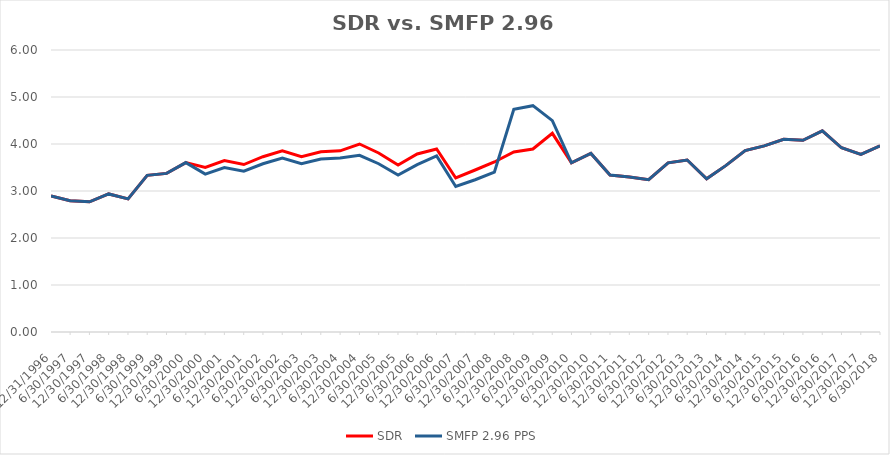
| Category | SDR | SMFP 2.96 PPS |
|---|---|---|
| 12/31/96 | 2.896 | 2.896 |
| 6/30/97 | 2.792 | 2.792 |
| 12/31/97 | 2.771 | 2.771 |
| 6/30/98 | 2.938 | 2.938 |
| 12/31/98 | 2.833 | 2.833 |
| 6/30/99 | 3.333 | 3.333 |
| 12/31/99 | 3.375 | 3.375 |
| 6/30/00 | 3.604 | 3.604 |
| 12/31/00 | 3.5 | 3.36 |
| 6/30/01 | 3.646 | 3.5 |
| 12/31/01 | 3.562 | 3.42 |
| 6/30/02 | 3.729 | 3.58 |
| 12/31/02 | 3.854 | 3.7 |
| 6/30/03 | 3.729 | 3.58 |
| 12/31/03 | 3.833 | 3.68 |
| 6/30/04 | 3.854 | 3.7 |
| 12/31/04 | 4 | 3.76 |
| 6/30/05 | 3.809 | 3.58 |
| 12/31/05 | 3.553 | 3.34 |
| 6/30/06 | 3.787 | 3.56 |
| 12/31/06 | 3.894 | 3.748 |
| 6/30/07 | 3.277 | 3.095 |
| 12/31/07 | 3.447 | 3.24 |
| 6/30/08 | 3.617 | 3.4 |
| 12/31/08 | 3.83 | 4.737 |
| 6/30/09 | 3.894 | 4.816 |
| 12/31/09 | 4.227 | 4.498 |
| 6/30/10 | 3.6 | 3.6 |
| 12/31/10 | 3.8 | 3.8 |
| 6/30/11 | 3.34 | 3.34 |
| 12/31/11 | 3.3 | 3.3 |
| 6/30/12 | 3.24 | 3.24 |
| 12/31/12 | 3.6 | 3.6 |
| 6/30/13 | 3.66 | 3.66 |
| 12/31/13 | 3.26 | 3.26 |
| 6/30/14 | 3.54 | 3.54 |
| 12/31/14 | 3.86 | 3.86 |
| 6/30/15 | 3.96 | 3.96 |
| 12/31/15 | 4.1 | 4.1 |
| 6/30/16 | 4.08 | 4.08 |
| 12/31/16 | 4.28 | 4.28 |
| 6/30/17 | 3.92 | 3.92 |
| 12/31/17 | 3.78 | 3.78 |
| 6/30/18 | 3.96 | 3.96 |